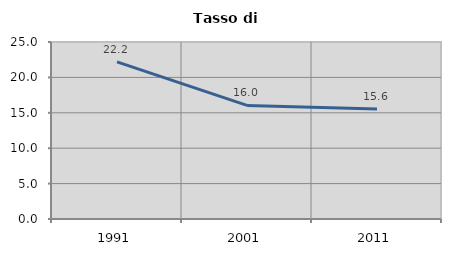
| Category | Tasso di disoccupazione   |
|---|---|
| 1991.0 | 22.187 |
| 2001.0 | 16.043 |
| 2011.0 | 15.554 |